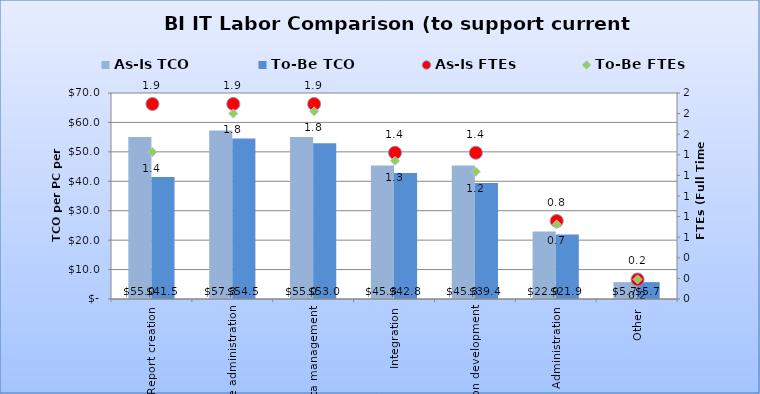
| Category | As-Is TCO | To-Be TCO |
|---|---|---|
| Report creation | 55.038 | 41.454 |
| Database administration | 57.295 | 54.504 |
| Data management | 55.038 | 52.961 |
| Integration | 45.329 | 42.817 |
| Application development | 45.329 | 39.443 |
| Administration | 22.918 | 21.898 |
| Other | 5.729 | 5.729 |